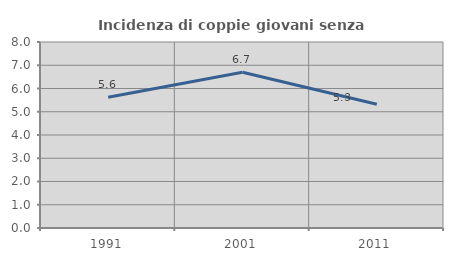
| Category | Incidenza di coppie giovani senza figli |
|---|---|
| 1991.0 | 5.62 |
| 2001.0 | 6.696 |
| 2011.0 | 5.325 |